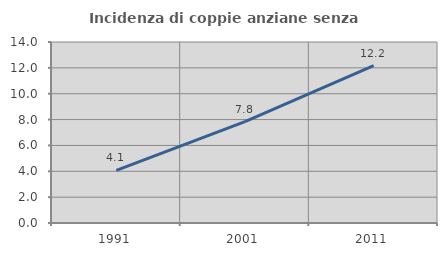
| Category | Incidenza di coppie anziane senza figli  |
|---|---|
| 1991.0 | 4.063 |
| 2001.0 | 7.843 |
| 2011.0 | 12.179 |